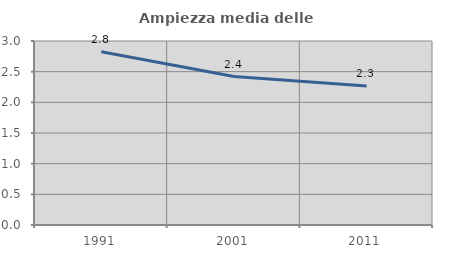
| Category | Ampiezza media delle famiglie |
|---|---|
| 1991.0 | 2.825 |
| 2001.0 | 2.42 |
| 2011.0 | 2.265 |